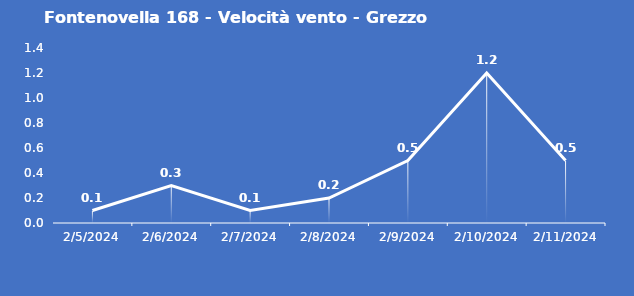
| Category | Fontenovella 168 - Velocità vento - Grezzo (m/s) |
|---|---|
| 2/5/24 | 0.1 |
| 2/6/24 | 0.3 |
| 2/7/24 | 0.1 |
| 2/8/24 | 0.2 |
| 2/9/24 | 0.5 |
| 2/10/24 | 1.2 |
| 2/11/24 | 0.5 |